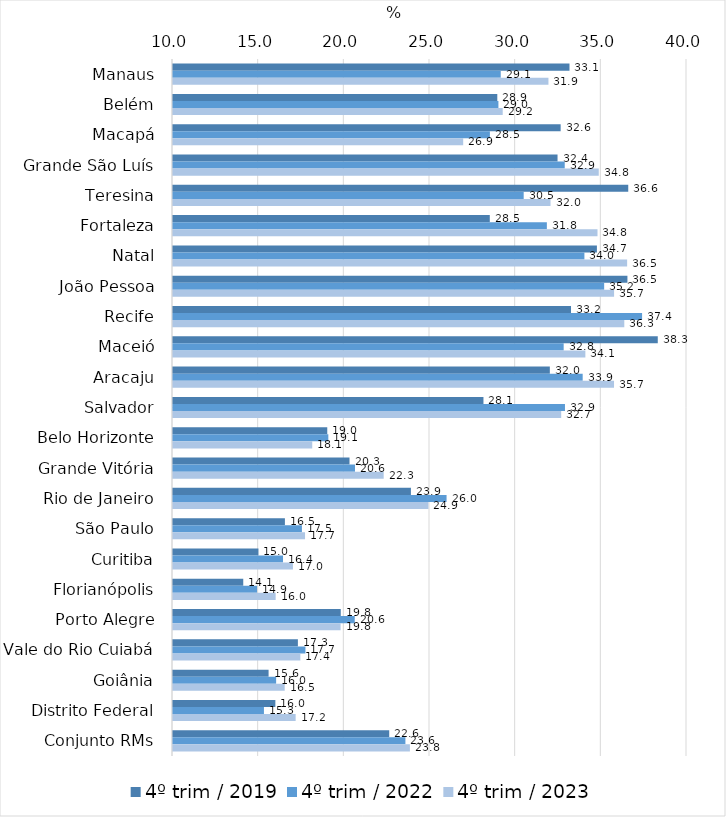
| Category | 4º trim / 2019 | 4º trim / 2022 | 4º trim / 2023 |
|---|---|---|---|
| Manaus | 33.141 | 29.129 | 31.913 |
| Belém | 28.928 | 28.993 | 29.244 |
| Macapá | 32.625 | 28.496 | 26.937 |
| Grande São Luís | 32.444 | 32.864 | 34.85 |
| Teresina | 36.571 | 30.469 | 32.035 |
| Fortaleza | 28.49 | 31.821 | 34.776 |
| Natal | 34.742 | 34.012 | 36.506 |
| João Pessoa | 36.523 | 35.165 | 35.744 |
| Recife | 33.23 | 37.378 | 36.34 |
| Maceió | 38.294 | 32.802 | 34.068 |
| Aracaju | 31.994 | 33.912 | 35.741 |
| Salvador | 28.12 | 32.878 | 32.657 |
| Belo Horizonte | 19.004 | 19.066 | 18.127 |
| Grande Vitória | 20.302 | 20.622 | 22.297 |
| Rio de Janeiro | 23.887 | 25.967 | 24.907 |
| São Paulo | 16.532 | 17.525 | 17.706 |
| Curitiba | 14.987 | 16.421 | 17 |
| Florianópolis | 14.1 | 14.907 | 15.992 |
| Porto Alegre | 19.792 | 20.607 | 19.781 |
| Vale do Rio Cuiabá | 17.289 | 17.73 | 17.433 |
| Goiânia | 15.579 | 16.019 | 16.52 |
| Distrito Federal | 15.974 | 15.308 | 17.158 |
| Conjunto RMs | 22.62 | 23.564 | 23.827 |